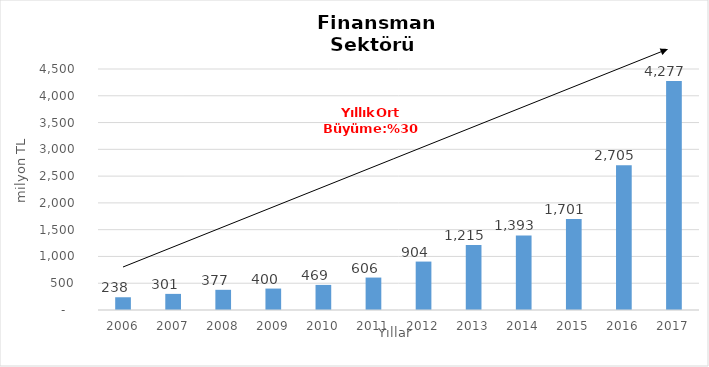
| Category | Finansman |
|---|---|
| 2006.0 | 237.908 |
| 2007.0 | 300.915 |
| 2008.0 | 377.007 |
| 2009.0 | 400.22 |
| 2010.0 | 468.569 |
| 2011.0 | 605.744 |
| 2012.0 | 904.24 |
| 2013.0 | 1214.696 |
| 2014.0 | 1393 |
| 2015.0 | 1701 |
| 2016.0 | 2705 |
| 2017.0 | 4277 |